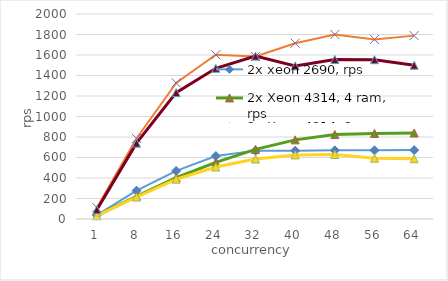
| Category | 2x xeon 2690, rps | 2x Xeon 4314, 4 ram, rps | 2x Xeon 4314, 2ram, rps | ryzen 7950x, 2 ram, rps | ryzen 7900x |
|---|---|---|---|---|---|
| 1 | 38 | 33 | 33 | 111 | 91 |
| 8 | 276 | 221 | 214 | 786 | 740 |
| 16 | 469 | 403 | 388 | 1328 | 1233 |
| 24 | 614 | 553 | 507 | 1602 | 1470 |
| 32 | 667 | 679 | 585 | 1585 | 1589 |
| 40 | 666 | 772 | 625 | 1715 | 1494 |
| 48 | 670 | 824 | 629 | 1800 | 1556 |
| 56 | 670 | 835 | 593 | 1752 | 1554 |
| 64 | 672 | 839 | 588 | 1789 | 1500 |